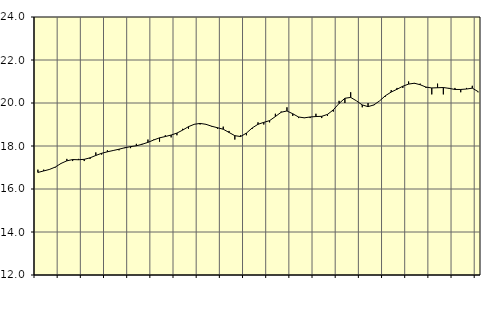
| Category | Piggar | Vård och omsorg, SNI 86-88 |
|---|---|---|
| nan | 16.9 | 16.77 |
| 1.0 | 16.9 | 16.84 |
| 1.0 | 16.9 | 16.91 |
| 1.0 | 17 | 17.02 |
| nan | 17.2 | 17.19 |
| 2.0 | 17.4 | 17.31 |
| 2.0 | 17.3 | 17.37 |
| 2.0 | 17.4 | 17.36 |
| nan | 17.3 | 17.38 |
| 3.0 | 17.4 | 17.45 |
| 3.0 | 17.7 | 17.56 |
| 3.0 | 17.6 | 17.66 |
| nan | 17.8 | 17.73 |
| 4.0 | 17.8 | 17.79 |
| 4.0 | 17.8 | 17.85 |
| 4.0 | 17.9 | 17.92 |
| nan | 17.9 | 17.97 |
| 5.0 | 18.1 | 18.01 |
| 5.0 | 18.1 | 18.08 |
| 5.0 | 18.3 | 18.17 |
| nan | 18.3 | 18.28 |
| 6.0 | 18.2 | 18.38 |
| 6.0 | 18.5 | 18.44 |
| 6.0 | 18.4 | 18.51 |
| nan | 18.5 | 18.6 |
| 7.0 | 18.8 | 18.74 |
| 7.0 | 18.8 | 18.9 |
| 7.0 | 19 | 19.01 |
| nan | 19 | 19.05 |
| 8.0 | 19 | 19.01 |
| 8.0 | 18.9 | 18.92 |
| 8.0 | 18.8 | 18.85 |
| nan | 18.9 | 18.78 |
| 9.0 | 18.7 | 18.63 |
| 9.0 | 18.3 | 18.48 |
| 9.0 | 18.5 | 18.44 |
| nan | 18.5 | 18.6 |
| 10.0 | 18.8 | 18.84 |
| 10.0 | 19.1 | 19.01 |
| 10.0 | 19 | 19.1 |
| nan | 19.1 | 19.18 |
| 11.0 | 19.5 | 19.37 |
| 11.0 | 19.6 | 19.57 |
| 11.0 | 19.8 | 19.63 |
| nan | 19.4 | 19.5 |
| 12.0 | 19.3 | 19.35 |
| 12.0 | 19.3 | 19.31 |
| 12.0 | 19.3 | 19.35 |
| nan | 19.5 | 19.37 |
| 13.0 | 19.3 | 19.38 |
| 13.0 | 19.4 | 19.47 |
| 13.0 | 19.6 | 19.68 |
| nan | 20.1 | 19.98 |
| 14.0 | 20 | 20.22 |
| 14.0 | 20.5 | 20.26 |
| 14.0 | 20.1 | 20.1 |
| nan | 19.8 | 19.91 |
| 15.0 | 20 | 19.83 |
| 15.0 | 19.9 | 19.91 |
| 15.0 | 20.1 | 20.1 |
| nan | 20.3 | 20.34 |
| 16.0 | 20.6 | 20.51 |
| 16.0 | 20.7 | 20.64 |
| 16.0 | 20.7 | 20.78 |
| nan | 21 | 20.88 |
| 17.0 | 20.9 | 20.92 |
| 17.0 | 20.9 | 20.85 |
| 17.0 | 20.7 | 20.74 |
| nan | 20.4 | 20.7 |
| 18.0 | 20.9 | 20.71 |
| 18.0 | 20.4 | 20.72 |
| 18.0 | 20.7 | 20.68 |
| nan | 20.7 | 20.63 |
| 19.0 | 20.5 | 20.63 |
| 19.0 | 20.7 | 20.65 |
| 19.0 | 20.8 | 20.69 |
| nan | 20.5 | 20.53 |